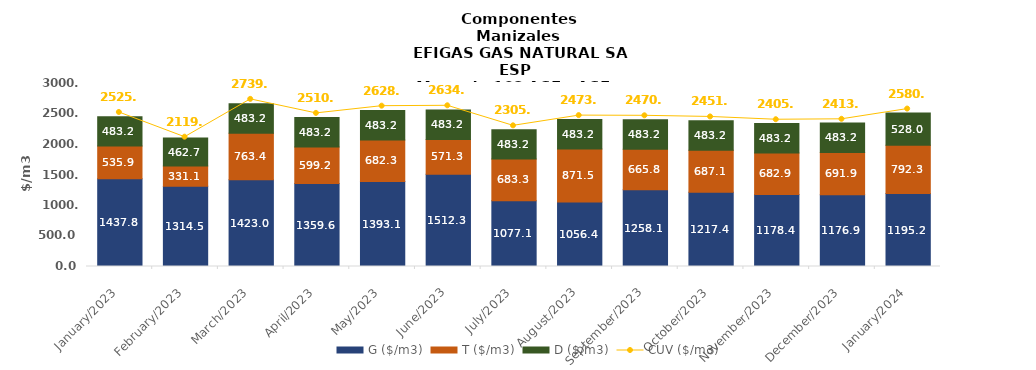
| Category | G ($/m3) | T ($/m3) | D ($/m3) |
|---|---|---|---|
| 2023-01-01 | 1437.76 | 535.94 | 483.2 |
| 2023-02-01 | 1314.49 | 331.09 | 462.69 |
| 2023-03-01 | 1422.95 | 763.36 | 483.205 |
| 2023-04-01 | 1359.57 | 599.24 | 483.2 |
| 2023-05-01 | 1393.1 | 682.25 | 483.2 |
| 2023-06-01 | 1512.34 | 571.34 | 483.2 |
| 2023-07-01 | 1077.14 | 683.33 | 483.2 |
| 2023-08-01 | 1056.36 | 871.51 | 483.2 |
| 2023-09-01 | 1258.12 | 665.75 | 483.2 |
| 2023-10-01 | 1217.367 | 687.084 | 483.205 |
| 2023-11-01 | 1178.421 | 682.88 | 483.205 |
| 2023-12-01 | 1176.905 | 691.935 | 483.205 |
| 2024-01-01 | 1195.188 | 792.332 | 528.046 |